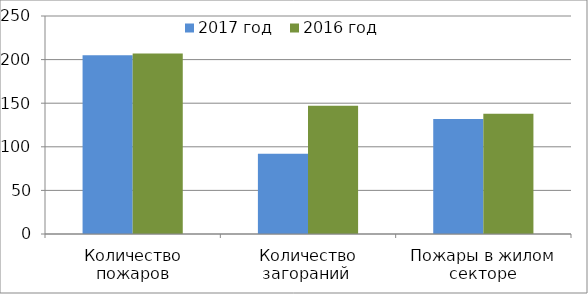
| Category | 2017 год | 2016 год |
|---|---|---|
| Количество пожаров | 205 | 207 |
| Количество загораний  | 92 | 147 |
| Пожары в жилом секторе | 132 | 138 |